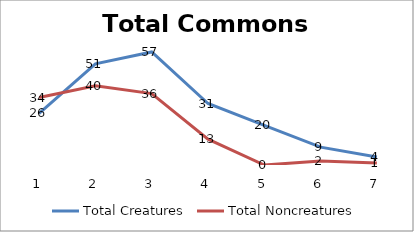
| Category | Total Creatures | Total Noncreatures |
|---|---|---|
| 0 | 26 | 34 |
| 1 | 51 | 40 |
| 2 | 57 | 36 |
| 3 | 31 | 13 |
| 4 | 20 | 0 |
| 5 | 9 | 2 |
| 6 | 4 | 1 |